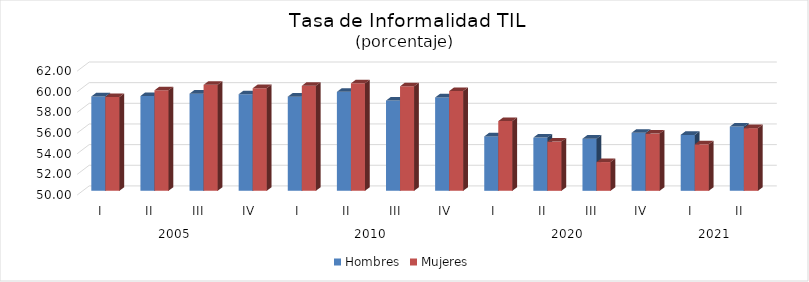
| Category | Hombres | Mujeres |
|---|---|---|
| 0 | 59.136 | 59.082 |
| 1 | 59.179 | 59.731 |
| 2 | 59.408 | 60.264 |
| 3 | 59.347 | 59.932 |
| 4 | 59.116 | 60.168 |
| 5 | 59.582 | 60.405 |
| 6 | 58.74 | 60.118 |
| 7 | 59.037 | 59.657 |
| 8 | 55.265 | 56.749 |
| 9 | 55.155 | 54.767 |
| 10 | 55.044 | 52.785 |
| 11 | 55.619 | 55.54 |
| 12 | 55.417 | 54.502 |
| 13 | 56.22 | 56.068 |